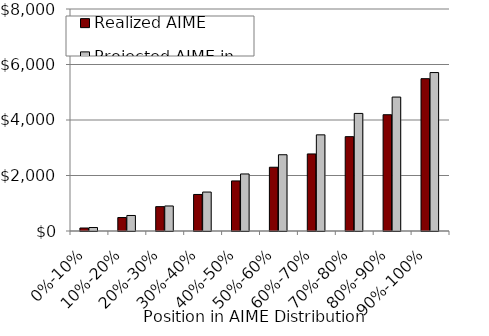
| Category | Realized AIME | Projected AIME in 1992 |
|---|---|---|
| 0%-10% | 107.714 | 125.494 |
| 10%-20% | 484.877 | 559.623 |
| 20%-30% | 877.606 | 901.943 |
| 30%-40% | 1316.519 | 1403.235 |
| 40%-50% | 1804.236 | 2055.258 |
| 50%-60% | 2297.683 | 2747.875 |
| 60%-70% | 2776.778 | 3464.98 |
| 70%-80% | 3400.056 | 4236.793 |
| 80%-90% | 4189.944 | 4826.46 |
| 90%-100% | 5489.153 | 5709.886 |